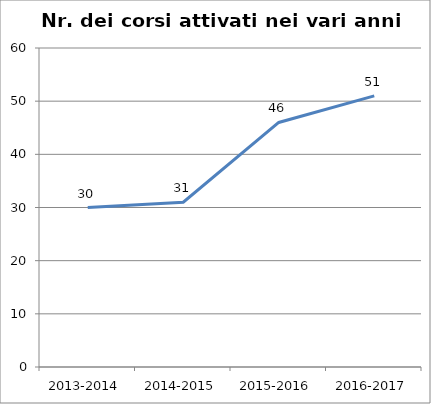
| Category | Nr. Corsi Attivati |
|---|---|
| 2013-2014 | 30 |
| 2014-2015 | 31 |
| 2015-2016 | 46 |
| 2016-2017 | 51 |